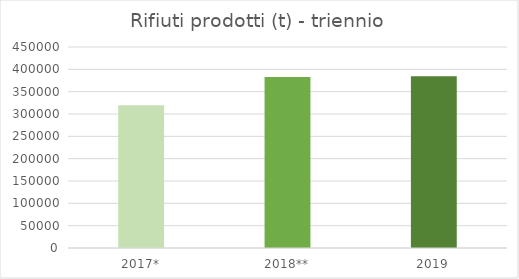
| Category | 2017* |
|---|---|
| 2017* | 319545 |
| 2018** | 382825 |
| 2019 | 384525 |